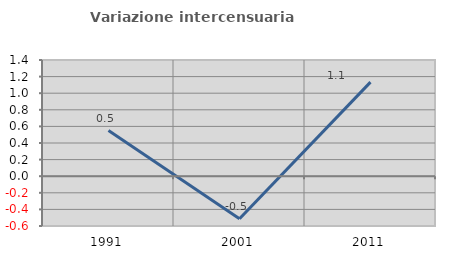
| Category | Variazione intercensuaria annua |
|---|---|
| 1991.0 | 0.55 |
| 2001.0 | -0.512 |
| 2011.0 | 1.133 |